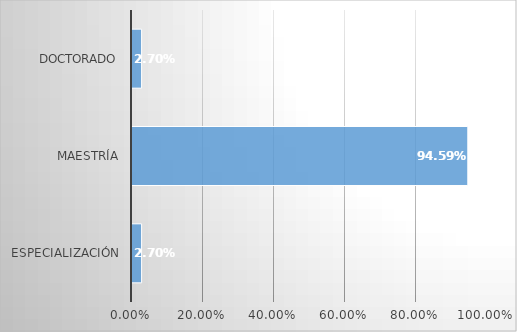
| Category | Series 0 |
|---|---|
| Especialización | 0.027 |
| Maestría | 0.946 |
| Doctorado | 0.027 |